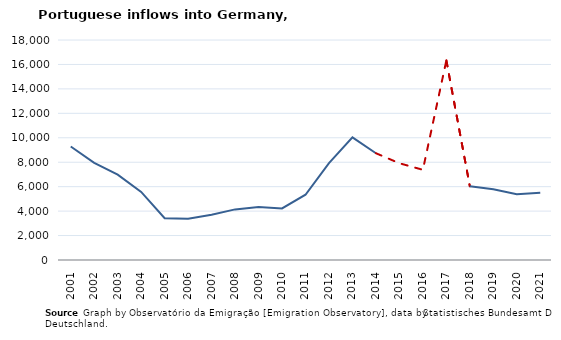
| Category | Entradas |
|---|---|
| 2001.0 | 9287 |
| 2002.0 | 7955 |
| 2003.0 | 6981 |
| 2004.0 | 5570 |
| 2005.0 | 3418 |
| 2006.0 | 3371 |
| 2007.0 | 3700 |
| 2008.0 | 4140 |
| 2009.0 | 4330 |
| 2010.0 | 4220 |
| 2011.0 | 5340 |
| 2012.0 | 7930 |
| 2013.0 | 10030 |
| 2014.0 | 8735 |
| 2015.0 | 7915 |
| 2016.0 | 7380 |
| 2017.0 | 16325 |
| 2018.0 | 6035 |
| 2019.0 | 5785 |
| 2020.0 | 5380 |
| 2021.0 | 5510 |